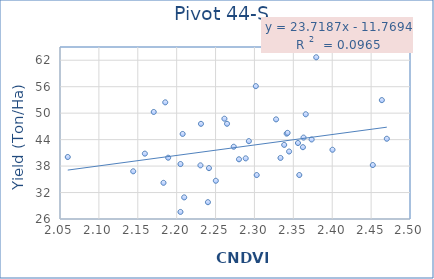
| Category | Series 0 |
|---|---|
| 2.470201 | 44.193 |
| 2.327822 | 48.59 |
| 2.341437 | 45.357 |
| 2.363131 | 44.457 |
| 2.189068 | 39.897 |
| 2.231237 | 47.577 |
| 2.204904 | 38.457 |
| 2.280119 | 39.537 |
| 2.342614 | 45.533 |
| 2.204878 | 27.6 |
| 2.159088 | 40.82 |
| 2.2647370000000002 | 47.593 |
| 2.373512 | 44.033 |
| 2.209672 | 30.9 |
| 2.302912 | 36.813 |
| 2.292823 | 35.96 |
| 2.355959 | 43.65 |
| 2.338237 | 43.227 |
| 2.365943 | 42.803 |
| 2.452175 | 49.743 |
| 2.261392 | 38.233 |
| 2.344563 | 48.74 |
| 2.207674 | 41.3 |
| 2.183063 | 45.283 |
| 2.24152 | 34.2 |
| 2.240201 | 40.053 |
| 2.250337 | 37.533 |
| 2.170506 | 29.81 |
| 2.230579 | 34.667 |
| 2.379425 | 50.267 |
| 2.273365 | 38.16 |
| 2.288769 | 39.84 |
| 2.357677 | 62.667 |
| 2.301769 | 42.387 |
| 2.362325 | 39.747 |
| 2.185307 | 35.967 |
| 2.463806 | 56.123 |
| 2.40033 | 42.28 |
| 2.354433 | 52.45 |
| 2.494959 | 52.953 |
| 2.3578 | 41.7 |